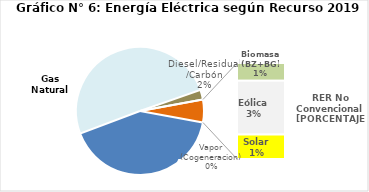
| Category | Series 0 |
|---|---|
| Agua | 1904.21 |
| Gas Natural | 2319.018 |
| Diesel/Residual/Carbón | 113.122 |
| Vapor (Cogeneracion) | 0.367 |
| Biomasa (BZ+BG) | 48.994 |
| Eólica | 148.463 |
| Solar | 67.258 |